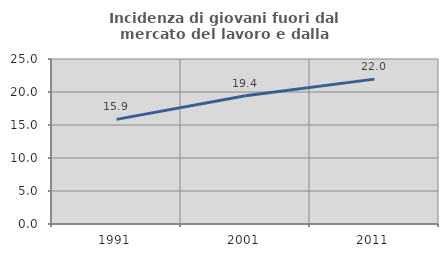
| Category | Incidenza di giovani fuori dal mercato del lavoro e dalla formazione  |
|---|---|
| 1991.0 | 15.854 |
| 2001.0 | 19.421 |
| 2011.0 | 21.951 |